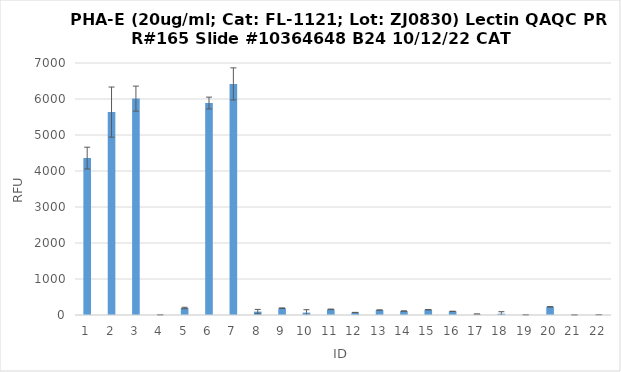
| Category | RFU |
|---|---|
| 0 | 4358.25 |
| 1 | 5636.25 |
| 2 | 6010.5 |
| 3 | 5.5 |
| 4 | 194.5 |
| 5 | 5887.75 |
| 6 | 6419.5 |
| 7 | 94.75 |
| 8 | 188.75 |
| 9 | 66.5 |
| 10 | 156.75 |
| 11 | 68.75 |
| 12 | 136.75 |
| 13 | 109.25 |
| 14 | 146.5 |
| 15 | 100.75 |
| 16 | 25 |
| 17 | 35.5 |
| 18 | 5.5 |
| 19 | 227.5 |
| 20 | 3.75 |
| 21 | 7.75 |